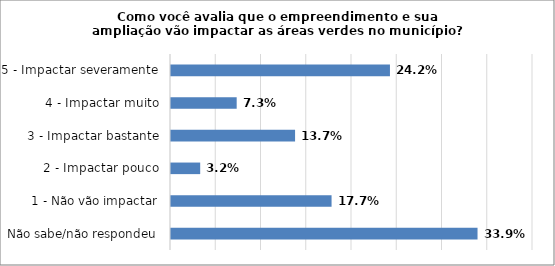
| Category | Series 0 |
|---|---|
| Não sabe/não respondeu | 0.339 |
| 1 - Não vão impactar | 0.177 |
| 2 - Impactar pouco | 0.032 |
| 3 - Impactar bastante | 0.137 |
| 4 - Impactar muito | 0.073 |
| 5 - Impactar severamente | 0.242 |